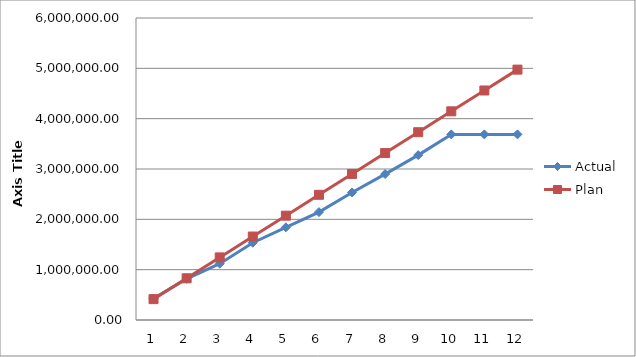
| Category | Actual | Plan |
|---|---|---|
| 0 | 426184.42 | 414550.917 |
| 1 | 817115.04 | 829101.833 |
| 2 | 1118836.29 | 1243652.75 |
| 3 | 1534958.42 | 1658203.667 |
| 4 | 1840590.52 | 2072754.583 |
| 5 | 2143501.9 | 2487305.5 |
| 6 | 2534154.27 | 2901856.417 |
| 7 | 2899041.02 | 3316407.333 |
| 8 | 3276282.84 | 3730958.25 |
| 9 | 3687897.89 | 4145509.167 |
| 10 | 3687897.89 | 4560060.083 |
| 11 | 3687897.89 | 4974611 |